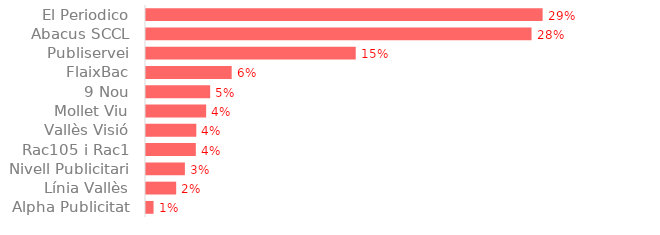
| Category | Series 0 |
|---|---|
| El Periodico | 9538 |
| Abacus SCCL | 9271.63 |
| Publiservei | 5043.89 |
| FlaixBac | 2060.63 |
| 9 Nou | 1542.75 |
| Mollet Viu | 1446.4 |
| Vallès Visió | 1210 |
| Rac105 i Rac1 | 1197.9 |
| Nivell Publicitari | 935.09 |
| Línia Vallès | 726 |
| Alpha Publicitat | 181.5 |